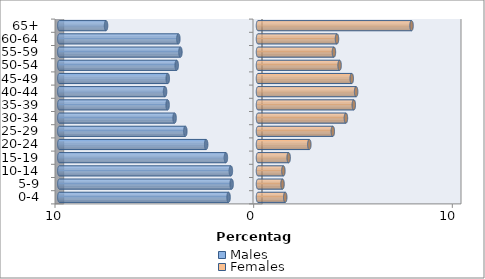
| Category | Males | Females |
|---|---|---|
| 0-4 | -1.482 | 1.371 |
| 5-9 | -1.327 | 1.234 |
| 10-14 | -1.366 | 1.277 |
| 15-19 | -1.617 | 1.543 |
| 20-24 | -2.61 | 2.583 |
| 25-29 | -3.658 | 3.766 |
| 30-34 | -4.199 | 4.425 |
| 35-39 | -4.55 | 4.822 |
| 40-44 | -4.678 | 4.939 |
| 45-49 | -4.542 | 4.719 |
| 50-54 | -4.093 | 4.108 |
| 55-59 | -3.905 | 3.822 |
| 60-64 | -4.009 | 3.976 |
| 65+ | -7.649 | 7.729 |